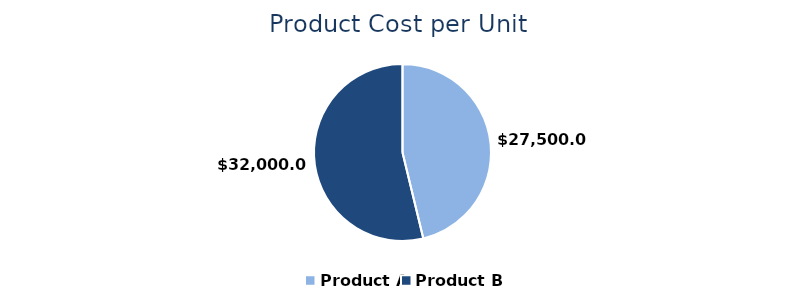
| Category | Product Cost per Unit |
|---|---|
| Product A | 27500 |
| Product B | 32000 |